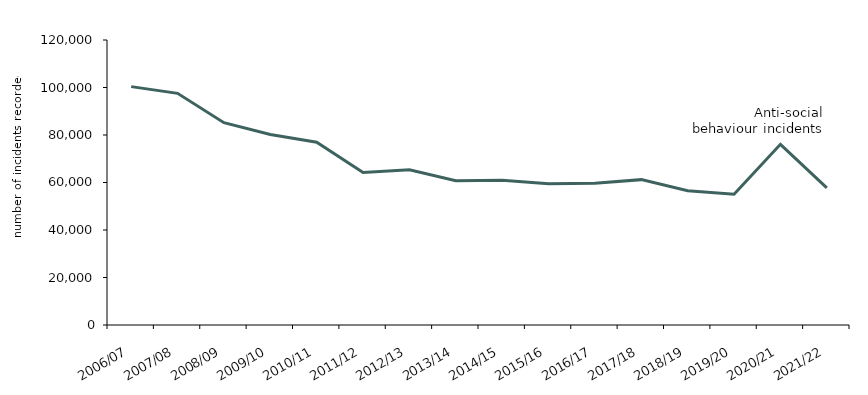
| Category | ASB incidents |
|---|---|
| 2006/07 | 100366 |
| 2007/08 | 97549 |
| 2008/09 | 85170 |
| 2009/10 | 80183 |
| 2010/11 | 76947 |
| 2011/12 | 64184 |
| 2012/13 | 65357 |
| 2013/14 | 60706 |
| 2014/15 | 60982 |
| 2015/16 | 59502 |
| 2016/17 | 59703 |
| 2017/18 | 61207 |
| 2018/19 | 56503 |
| 2019/20 | 55031 |
| 2020/21 | 76063 |
| 2021/22 | 57732 |